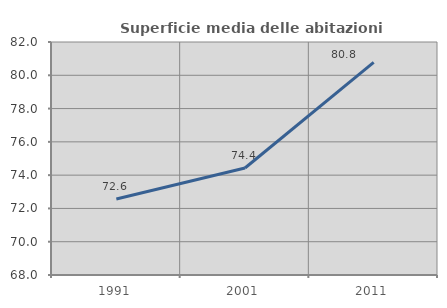
| Category | Superficie media delle abitazioni occupate |
|---|---|
| 1991.0 | 72.571 |
| 2001.0 | 74.429 |
| 2011.0 | 80.781 |